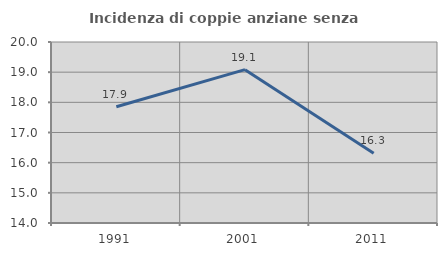
| Category | Incidenza di coppie anziane senza figli  |
|---|---|
| 1991.0 | 17.853 |
| 2001.0 | 19.084 |
| 2011.0 | 16.31 |